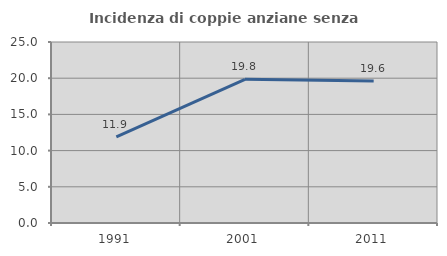
| Category | Incidenza di coppie anziane senza figli  |
|---|---|
| 1991.0 | 11.886 |
| 2001.0 | 19.843 |
| 2011.0 | 19.619 |